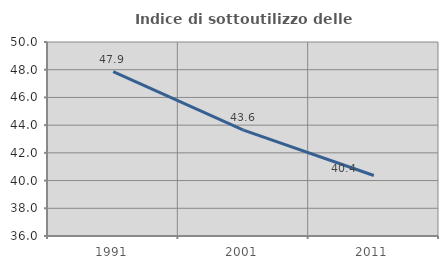
| Category | Indice di sottoutilizzo delle abitazioni  |
|---|---|
| 1991.0 | 47.863 |
| 2001.0 | 43.636 |
| 2011.0 | 40.367 |